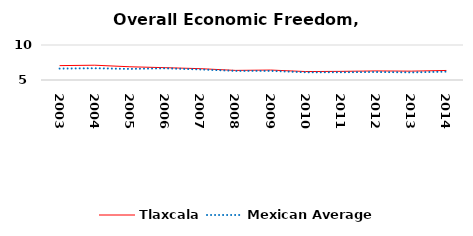
| Category | Tlaxcala | Mexican Average  |
|---|---|---|
| 2003.0 | 7.054 | 6.632 |
| 2004.0 | 7.113 | 6.678 |
| 2005.0 | 6.889 | 6.582 |
| 2006.0 | 6.759 | 6.668 |
| 2007.0 | 6.62 | 6.508 |
| 2008.0 | 6.371 | 6.3 |
| 2009.0 | 6.421 | 6.3 |
| 2010.0 | 6.208 | 6.105 |
| 2011.0 | 6.234 | 6.103 |
| 2012.0 | 6.296 | 6.144 |
| 2013.0 | 6.264 | 6.087 |
| 2014.0 | 6.363 | 6.195 |